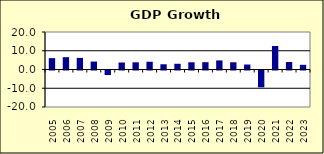
| Category | 4.5 |
|---|---|
| 2005.0 | 6.051 |
| 2006.0 | 6.567 |
| 2007.0 | 6.188 |
| 2008.0 | 4.232 |
| 2009.0 | -2.432 |
| 2010.0 | 3.731 |
| 2011.0 | 3.836 |
| 2012.0 | 4.129 |
| 2013.0 | 2.792 |
| 2014.0 | 3.058 |
| 2015.0 | 3.84 |
| 2016.0 | 3.893 |
| 2017.0 | 4.843 |
| 2018.0 | 3.845 |
| 2019.0 | 2.653 |
| 2020.0 | -8.965 |
| 2021.0 | 12.534 |
| 2022.0 | 4 |
| 2023.0 | 2.5 |